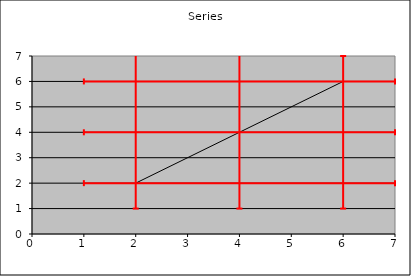
| Category | Series |
|---|---|
| 2.0 | 2 |
| 4.0 | 4 |
| 6.0 | 6 |